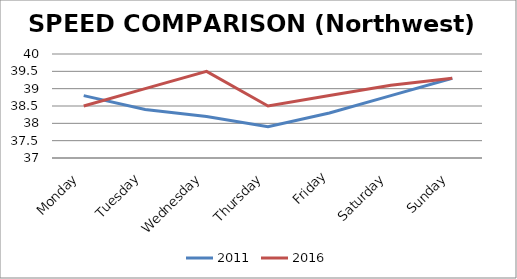
| Category | 2011 | 2016 |
|---|---|---|
| Monday | 38.8 | 38.5 |
| Tuesday | 38.4 | 39 |
| Wednesday | 38.2 | 39.5 |
| Thursday | 37.9 | 38.5 |
| Friday | 38.3 | 38.8 |
| Saturday | 38.8 | 39.1 |
| Sunday | 39.3 | 39.3 |